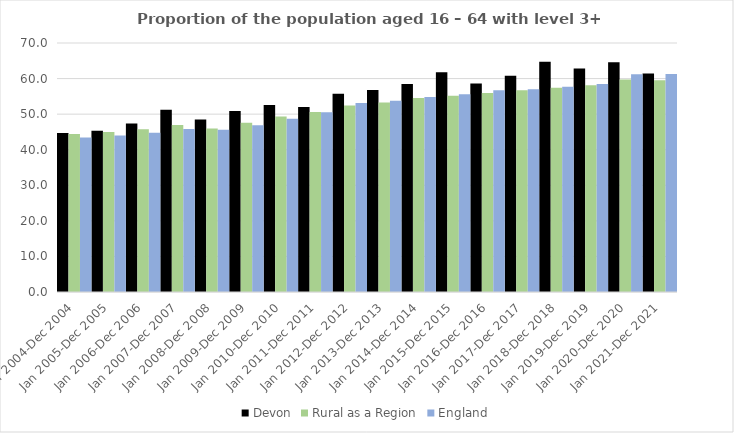
| Category | Devon | Rural as a Region | England |
|---|---|---|---|
| Jan 2004-Dec 2004 | 44.7 | 44.405 | 43.4 |
| Jan 2005-Dec 2005 | 45.3 | 44.973 | 44 |
| Jan 2006-Dec 2006 | 47.4 | 45.774 | 44.8 |
| Jan 2007-Dec 2007 | 51.2 | 46.968 | 45.8 |
| Jan 2008-Dec 2008 | 48.5 | 45.964 | 45.6 |
| Jan 2009-Dec 2009 | 50.9 | 47.59 | 46.9 |
| Jan 2010-Dec 2010 | 52.6 | 49.362 | 48.7 |
| Jan 2011-Dec 2011 | 52 | 50.602 | 50.5 |
| Jan 2012-Dec 2012 | 55.7 | 52.439 | 53.1 |
| Jan 2013-Dec 2013 | 56.8 | 53.276 | 53.8 |
| Jan 2014-Dec 2014 | 58.5 | 54.57 | 54.8 |
| Jan 2015-Dec 2015 | 61.8 | 55.16 | 55.6 |
| Jan 2016-Dec 2016 | 58.6 | 55.941 | 56.7 |
| Jan 2017-Dec 2017 | 60.8 | 56.689 | 57 |
| Jan 2018-Dec 2018 | 64.7 | 57.389 | 57.7 |
| Jan 2019-Dec 2019 | 62.8 | 58.147 | 58.5 |
| Jan 2020-Dec 2020 | 64.6 | 59.771 | 61.2 |
| Jan 2021-Dec 2021 | 61.4 | 59.54 | 61.3 |